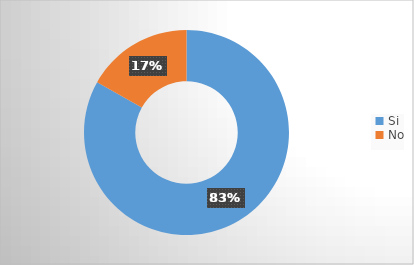
| Category | Series 0 |
|---|---|
| Si | 0.832 |
| No | 0.168 |